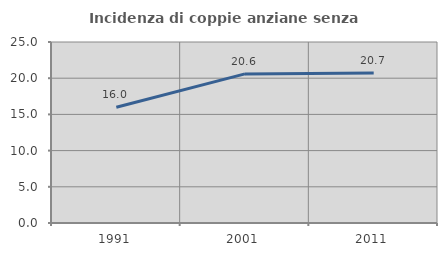
| Category | Incidenza di coppie anziane senza figli  |
|---|---|
| 1991.0 | 15.983 |
| 2001.0 | 20.595 |
| 2011.0 | 20.716 |